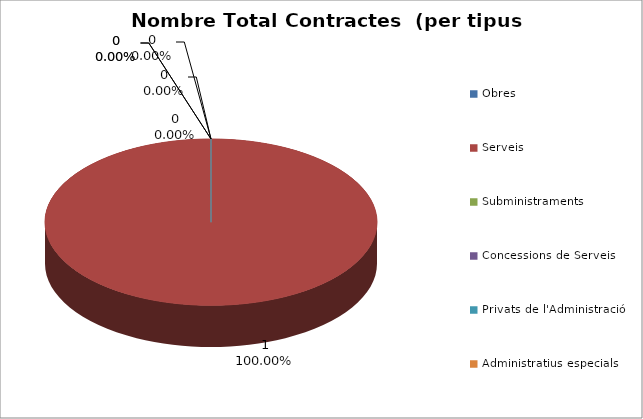
| Category | Nombre Total Contractes |
|---|---|
| Obres | 0 |
| Serveis | 1 |
| Subministraments | 0 |
| Concessions de Serveis | 0 |
| Privats de l'Administració | 0 |
| Administratius especials | 0 |